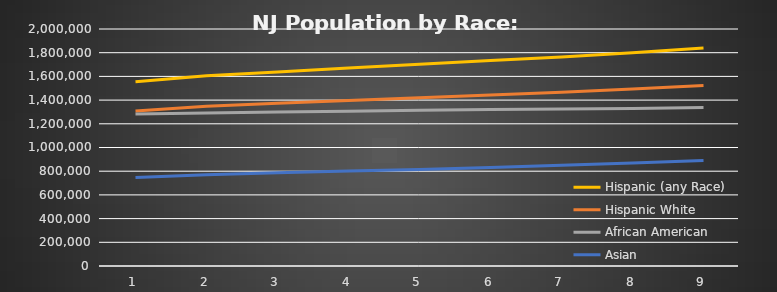
| Category | Hispanic (any Race) | Hispanic White | African American | Asian |
|---|---|---|---|---|
| 0 | 1555144 | 1308124 | 1282005 | 746212 |
| 1 | 1604789 | 1347477 | 1291232 | 769720 |
| 2 | 1638100 | 1372811 | 1298746 | 786204 |
| 3 | 1670491 | 1396996 | 1306862 | 800889 |
| 4 | 1702805 | 1420451 | 1314397 | 814932 |
| 5 | 1733370 | 1442333 | 1320659 | 832209 |
| 6 | 1764567 | 1466103 | 1325075 | 849276 |
| 7 | 1800000 | 1493330 | 1330103 | 869835 |
| 8 | 1839359 | 1523452 | 1337754 | 889251 |